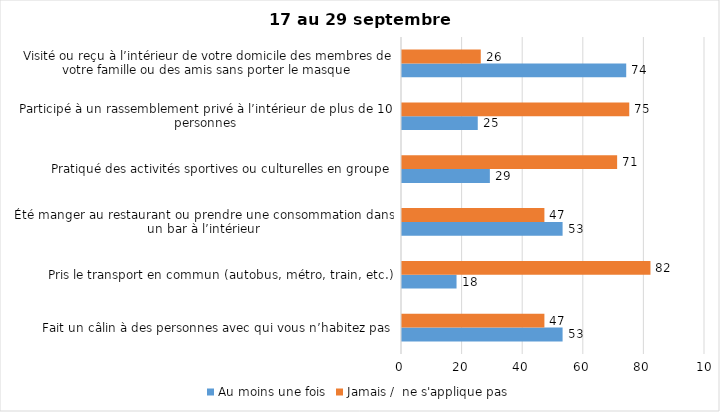
| Category | Au moins une fois | Jamais /  ne s'applique pas |
|---|---|---|
| Fait un câlin à des personnes avec qui vous n’habitez pas | 53 | 47 |
| Pris le transport en commun (autobus, métro, train, etc.) | 18 | 82 |
| Été manger au restaurant ou prendre une consommation dans un bar à l’intérieur | 53 | 47 |
| Pratiqué des activités sportives ou culturelles en groupe | 29 | 71 |
| Participé à un rassemblement privé à l’intérieur de plus de 10 personnes | 25 | 75 |
| Visité ou reçu à l’intérieur de votre domicile des membres de votre famille ou des amis sans porter le masque | 74 | 26 |